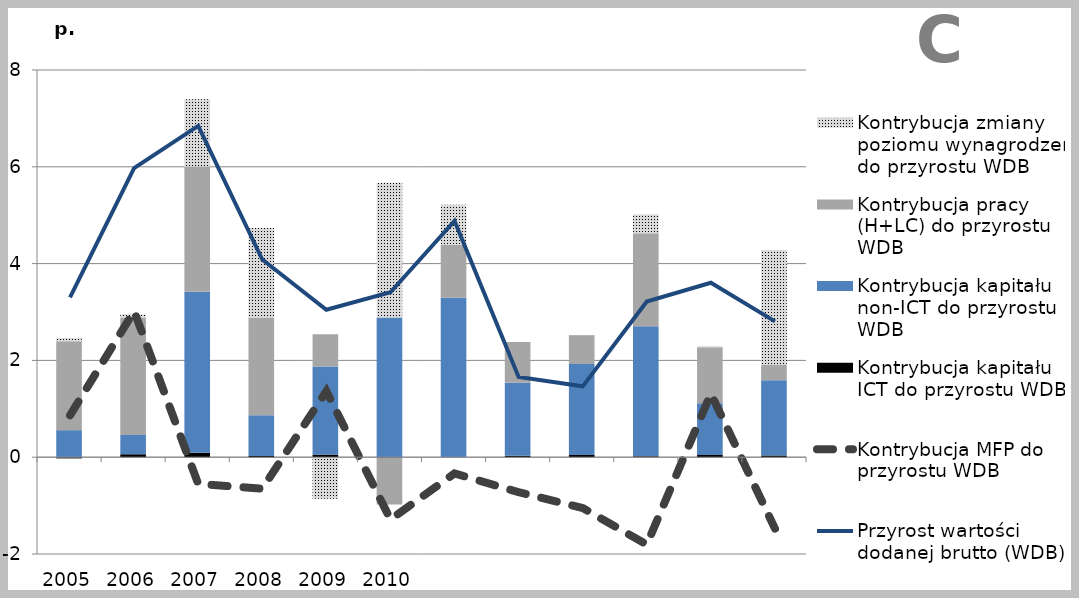
| Category | Kontrybucja kapitału ICT do przyrostu WDB | Kontrybucja kapitału non-ICT do przyrostu WDB | Kontrybucja pracy (H+LC) do przyrostu WDB | Kontrybucja zmiany poziomu wynagrodzeń do przyrostu WDB |
|---|---|---|---|---|
| 2005.0 | -0.025 | 0.559 | 1.836 | 0.067 |
| 2006.0 | 0.061 | 0.4 | 2.425 | 0.066 |
| 2007.0 | 0.09 | 3.329 | 2.58 | 1.397 |
| 2008.0 | 0.025 | 0.842 | 2.019 | 1.849 |
| 2009.0 | 0.052 | 1.823 | 0.665 | -0.859 |
| 2010.0 | -0.009 | 2.884 | -0.968 | 2.787 |